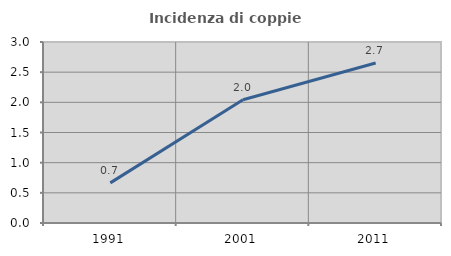
| Category | Incidenza di coppie miste |
|---|---|
| 1991.0 | 0.665 |
| 2001.0 | 2.043 |
| 2011.0 | 2.651 |